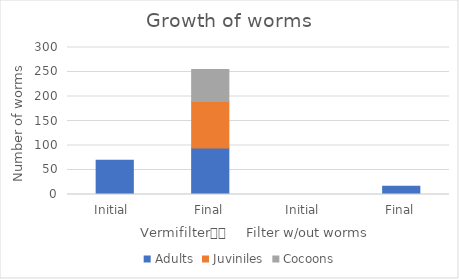
| Category | Adults | Juviniles | Cocoons |
|---|---|---|---|
| Initial  | 70 | 0 | 0 |
| Final | 95 | 95 | 65 |
| Initial  | 0 | 0 | 0 |
| Final | 17 | 0 | 0 |